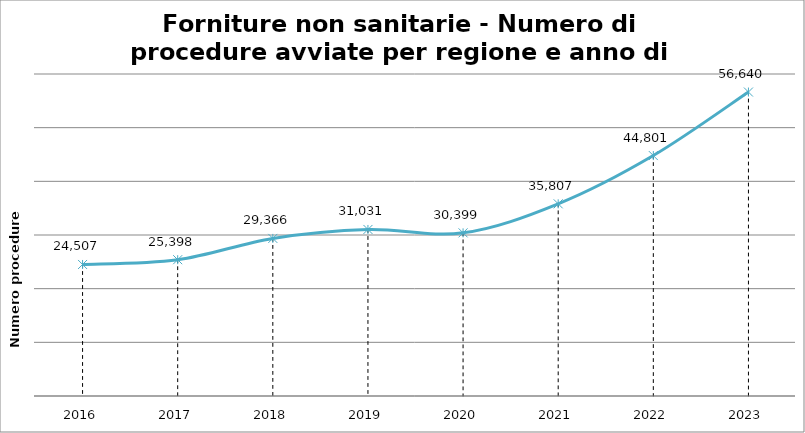
| Category | Totale |
|---|---|
| 2016.0 | 24507 |
| 2017.0 | 25398 |
| 2018.0 | 29366 |
| 2019.0 | 31031 |
| 2020.0 | 30399 |
| 2021.0 | 35807 |
| 2022.0 | 44801 |
| 2023.0 | 56640 |